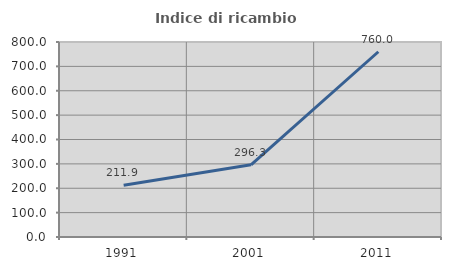
| Category | Indice di ricambio occupazionale  |
|---|---|
| 1991.0 | 211.905 |
| 2001.0 | 296.296 |
| 2011.0 | 760 |